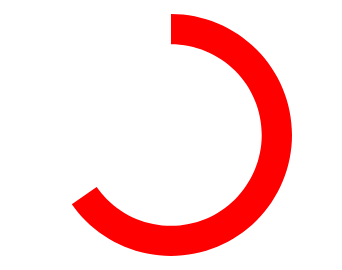
| Category | Series 0 |
|---|---|
| 0 | 7.9 |
| 1 | 4.2 |